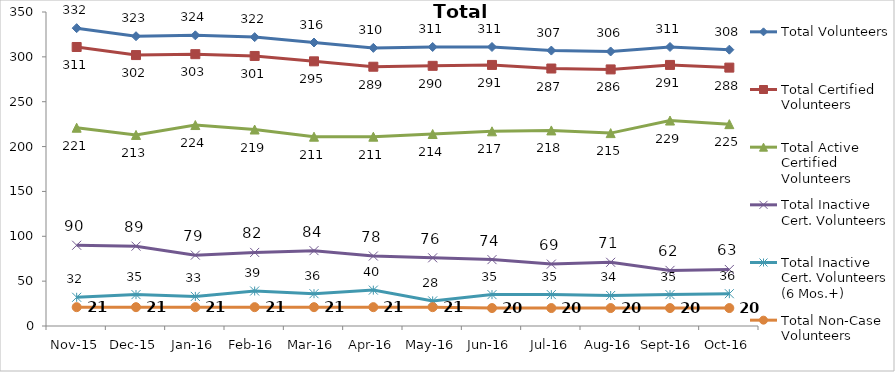
| Category | Total Volunteers | Total Certified Volunteers | Total Active Certified Volunteers | Total Inactive Cert. Volunteers | Total Inactive Cert. Volunteers (6 Mos.+) | Total Non-Case Volunteers |
|---|---|---|---|---|---|---|
| Nov-15 | 332 | 311 | 221 | 90 | 32 | 21 |
| Dec-15 | 323 | 302 | 213 | 89 | 35 | 21 |
| Jan-16 | 324 | 303 | 224 | 79 | 33 | 21 |
| Feb-16 | 322 | 301 | 219 | 82 | 39 | 21 |
| Mar-16 | 316 | 295 | 211 | 84 | 36 | 21 |
| Apr-16 | 310 | 289 | 211 | 78 | 40 | 21 |
| May-16 | 311 | 290 | 214 | 76 | 28 | 21 |
| Jun-16 | 311 | 291 | 217 | 74 | 35 | 20 |
| Jul-16 | 307 | 287 | 218 | 69 | 35 | 20 |
| Aug-16 | 306 | 286 | 215 | 71 | 34 | 20 |
| Sep-16 | 311 | 291 | 229 | 62 | 35 | 20 |
| Oct-16 | 308 | 288 | 225 | 63 | 36 | 20 |